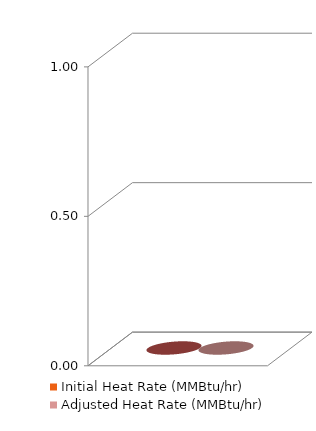
| Category | Initial Heat Rate (MMBtu/hr) | Adjusted Heat Rate (MMBtu/hr) |
|---|---|---|
| 0 | 0 | 0 |